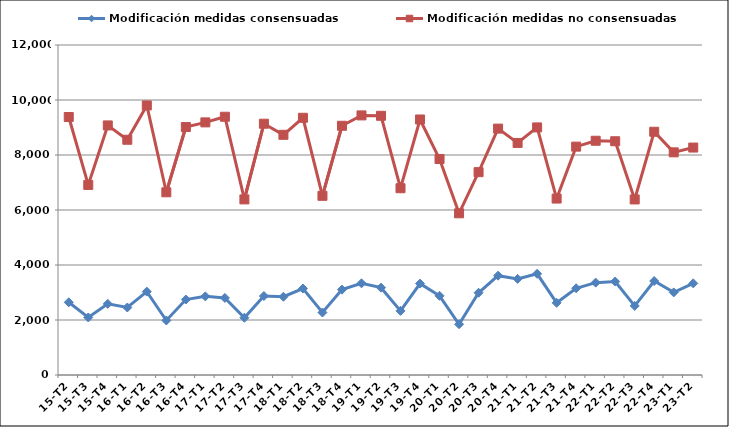
| Category | Modificación medidas consensuadas | Modificación medidas no consensuadas |
|---|---|---|
| 15-T2 | 2644 | 9382 |
| 15-T3 | 2092 | 6911 |
| 15-T4 | 2586 | 9076 |
| 16-T1 | 2455 | 8554 |
| 16-T2 | 3032 | 9802 |
| 16-T3 | 1983 | 6644 |
| 16-T4 | 2744 | 9017 |
| 17-T1 | 2859 | 9186 |
| 17-T2 | 2804 | 9391 |
| 17-T3 | 2082 | 6385 |
| 17-T4 | 2872 | 9137 |
| 18-T1 | 2846 | 8734 |
| 18-T2 | 3144 | 9353 |
| 18-T3 | 2272 | 6516 |
| 18-T4 | 3104 | 9063 |
| 19-T1 | 3335 | 9440 |
| 19-T2 | 3176 | 9426 |
| 19-T3 | 2332 | 6792 |
| 19-T4 | 3323 | 9291 |
| 20-T1 | 2880 | 7854 |
| 20-T2 | 1846 | 5880 |
| 20-T3 | 2991 | 7376 |
| 20-T4 | 3612 | 8960 |
| 21-T1 | 3496 | 8439 |
| 21-T2 | 3680 | 9003 |
| 21-T3 | 2625 | 6416 |
| 21-T4 | 3154 | 8304 |
| 22-T1 | 3359 | 8518 |
| 22-T2 | 3398 | 8500 |
| 22-T3 | 2512 | 6384 |
| 22-T4 | 3417 | 8845 |
| 23-T1 | 3003 | 8097 |
| 23-T2 | 3332 | 8271 |